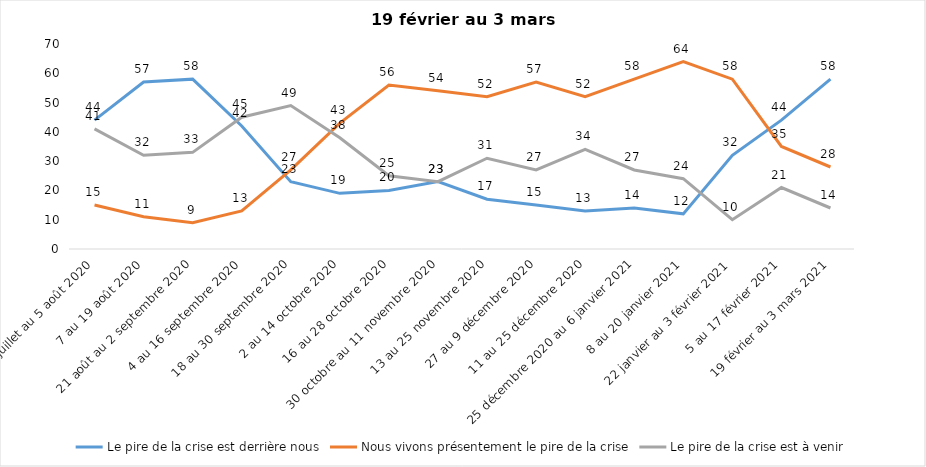
| Category | Le pire de la crise est derrière nous | Nous vivons présentement le pire de la crise | Le pire de la crise est à venir |
|---|---|---|---|
| 24 juillet au 5 août 2020 | 44 | 15 | 41 |
| 7 au 19 août 2020 | 57 | 11 | 32 |
| 21 août au 2 septembre 2020 | 58 | 9 | 33 |
| 4 au 16 septembre 2020 | 42 | 13 | 45 |
| 18 au 30 septembre 2020 | 23 | 27 | 49 |
| 2 au 14 octobre 2020 | 19 | 43 | 38 |
| 16 au 28 octobre 2020 | 20 | 56 | 25 |
| 30 octobre au 11 novembre 2020 | 23 | 54 | 23 |
| 13 au 25 novembre 2020 | 17 | 52 | 31 |
| 27 au 9 décembre 2020 | 15 | 57 | 27 |
| 11 au 25 décembre 2020 | 13 | 52 | 34 |
| 25 décembre 2020 au 6 janvier 2021 | 14 | 58 | 27 |
| 8 au 20 janvier 2021 | 12 | 64 | 24 |
| 22 janvier au 3 février 2021 | 32 | 58 | 10 |
| 5 au 17 février 2021 | 44 | 35 | 21 |
| 19 février au 3 mars 2021 | 58 | 28 | 14 |